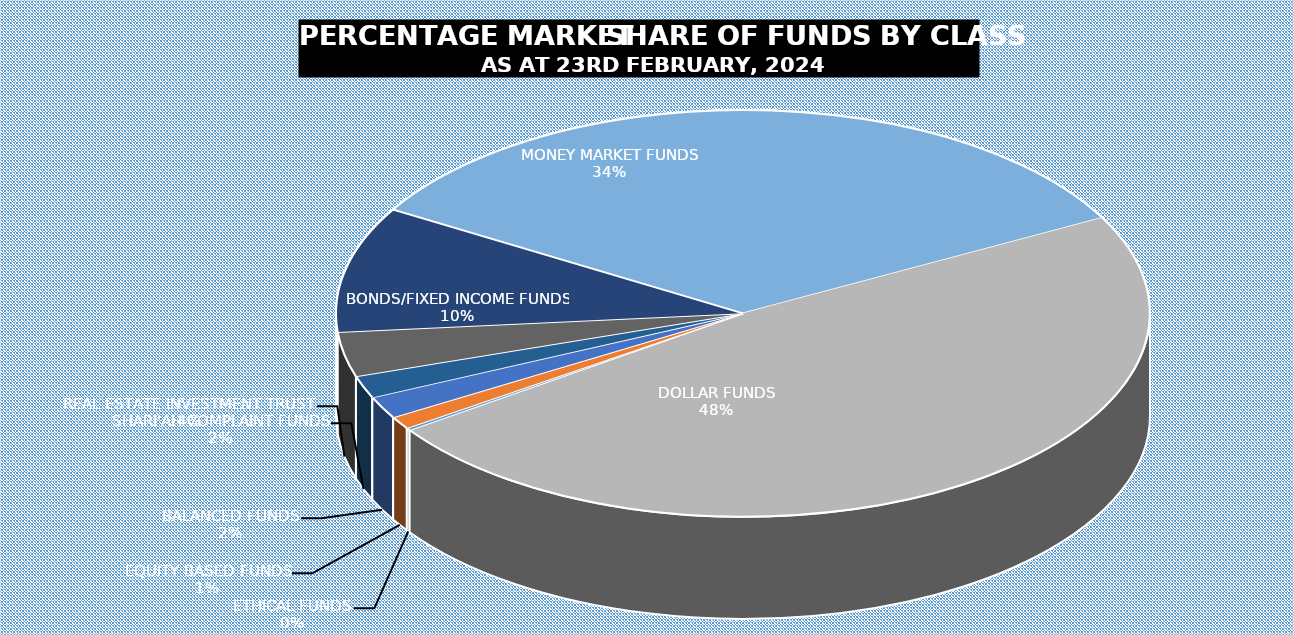
| Category | 23-Feb |
|---|---|
| ETHICAL FUNDS | 5257385484.97 |
| EQUITY BASED FUNDS | 28192321561.755 |
| BALANCED FUNDS | 49520617624.731 |
| SHARI'AH COMPLAINT FUNDS | 49943289569.65 |
| REAL ESTATE INVESTMENT TRUST | 99722351454.057 |
| BONDS/FIXED INCOME FUNDS | 281780566180.146 |
| MONEY MARKET FUNDS | 949382861578.855 |
| DOLLAR FUNDS | 1354299215906.88 |